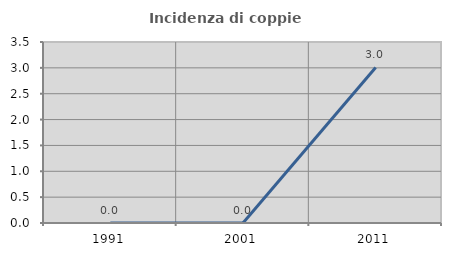
| Category | Incidenza di coppie miste |
|---|---|
| 1991.0 | 0 |
| 2001.0 | 0 |
| 2011.0 | 3.008 |